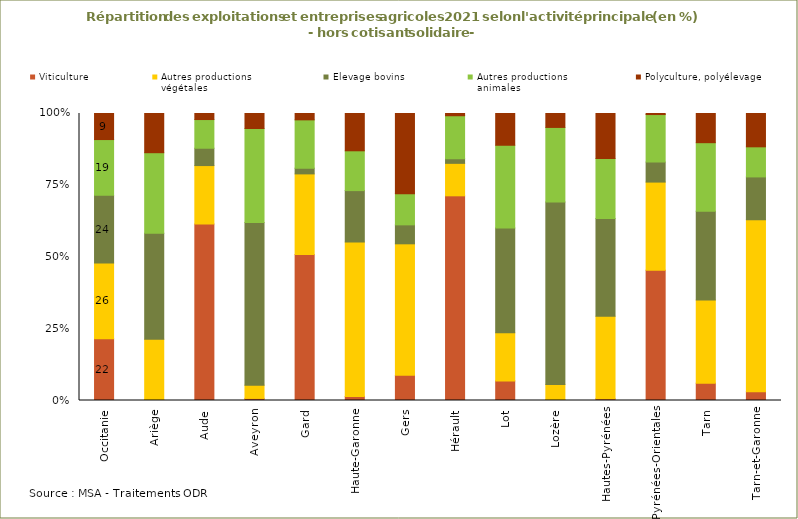
| Category | Viticulture | Autres productions 
végétales | Elevage bovins | Autres productions
animales | Polyculture, polyélevage |
|---|---|---|---|---|---|
| Occitanie | 21.507 | 26.439 | 23.542 | 19.43 | 9.081 |
| Ariège | 0.219 | 21.119 | 36.972 | 28.031 | 13.659 |
| Aude | 61.537 | 20.319 | 6.04 | 9.998 | 2.106 |
| Aveyron | 0.728 | 4.624 | 56.686 | 32.739 | 5.223 |
| Gard | 50.832 | 28.124 | 1.988 | 16.845 | 2.211 |
| Haute-Garonne | 1.435 | 53.815 | 17.88 | 13.876 | 12.994 |
| Gers | 8.815 | 45.778 | 6.607 | 10.829 | 27.971 |
| Hérault | 71.317 | 11.317 | 1.622 | 14.962 | 0.782 |
| Lot | 6.826 | 16.791 | 36.525 | 28.793 | 11.064 |
| Lozère | 0.211 | 5.401 | 63.586 | 25.949 | 4.852 |
| Hautes-Pyrénées | 0.608 | 28.74 | 34.109 | 20.902 | 15.641 |
| Pyrénées-Orientales | 45.367 | 30.734 | 6.972 | 16.56 | 0.367 |
| Tarn | 6.031 | 28.968 | 30.911 | 23.921 | 10.169 |
| Tarn-et-Garonne | 3.081 | 59.913 | 14.908 | 10.489 | 11.609 |